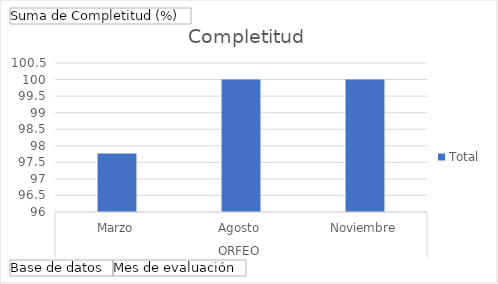
| Category | Total |
|---|---|
| 0 | 97.77 |
| 1 | 100 |
| 2 | 100 |